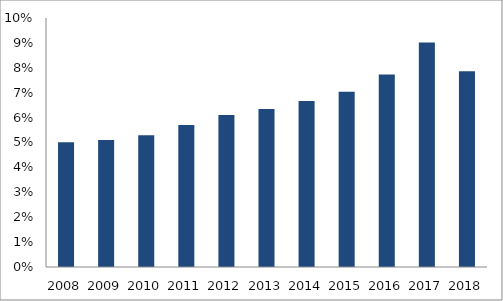
| Category | Series 0 |
|---|---|
| 2008.0 | 0.05 |
| 2009.0 | 0.051 |
| 2010.0 | 0.053 |
| 2011.0 | 0.057 |
| 2012.0 | 0.061 |
| 2013.0 | 0.063 |
| 2014.0 | 0.067 |
| 2015.0 | 0.07 |
| 2016.0 | 0.077 |
| 2017.0 | 0.09 |
| 2018.0 | 0.079 |